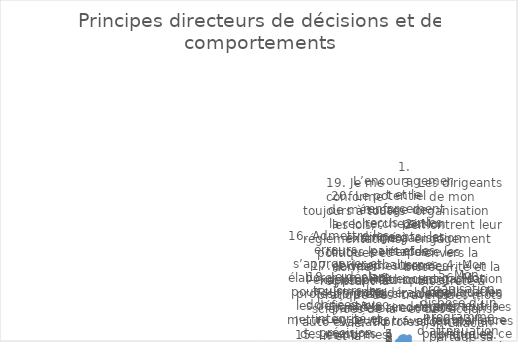
| Category | Series 0 |
|---|---|
| 1. L’encouragement et le renforcement reçus par les dirigeants, les pairs et les subalternes influencent considérablement le rendement au travail. | 3 |
| 2. Mon organisation renforce les normes éthiques et un code de conduite professionnel. | 3 |
| 3. Les dirigeants de mon organisation démontrent leur engagement envers la biosécurité et la biosûreté à travers des mots et des actions. | 1 |
| 4. Mon organisation applique les leçons apprises et les meilleures pratiques. | 5 |
| 5. Mon organisation dispose d’un programme d’atténuation des menaces internes. | 4 |
| 6. Mon organisation promeut la transparence publique en ce qui concerne sa conformité aux exigences de biosécurité et de biosûreté. | 4 |
| 7. Chacun partage sa responsabilité personnelle en matière de de biosécurité et de biosûreté. | 4 |
| 8. Je connais le concept et les implications de la recherche préoccupante à double usage. | 0 |
| 9. Des personnes dûment qualifiées et formées assurent la surveillance de la biosécurité et de la biosûreté. | 2 |
| 10. Lorsqu’un incident ou un quasi-accident se produit, les gens procèdent à un remue-méninge au lieu de se blâmer. La question posée est « qu’est-ce qui a mal tourné ? » pas « qui avait tort ? », en se concentrant sur l’amélioration, pas sur le blâme. | 0 |
| 11. Je considère les implications et les applications possibles de mon travail et l’équilibre entre la recherche de connaissances scientifiques et mes responsabilités éthiques envers la société. | 2 |
| 12. Je suis motivé pour minimiser les risques de mésusage de la science pour la société. | 4 |
| 13. Je suis conscient de la menace du bioterrorisme et des armes biologiques. | 2 |
| 14. Mon organisation a mis en place un code de conduite responsable. | 1 |
| 15. Les normes sont appliquées dans mon organisation. | 1 |
| 16. Admettre les erreurs, s’approprier et élaborer un plan pour surmonter les défis et/ou mettre en œuvre des mesures correctives font partie intégrante d’une biosécurité et d’une biosûreté efficaces. | 4 |
| 17. Je vise l’excellence professionnelle par l’auto-évaluation et la formation continue. | 0 |
| 18. Je déclare toujours les données avec intégrité et précision. | 1 |
| 19. Je me conforme toujours à toutes les lois, réglementations, politiques et normes régissant la pratique des sciences de la vie. | 3 |
| 20. Le potentiel de mésusage de la recherche est examiné à toutes les étapes et des mesures appropriées sont prises si nécessaire. | 3 |